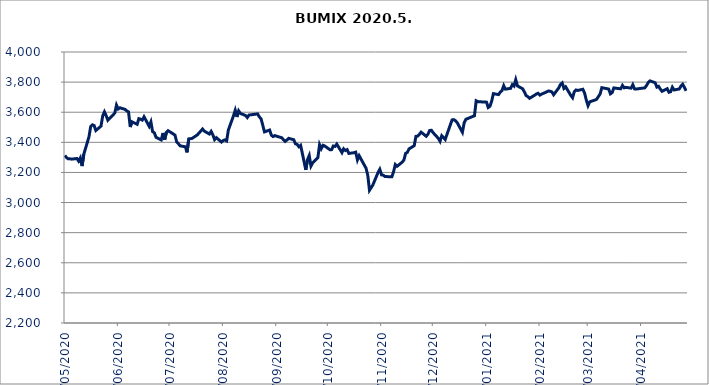
| Category | BUMIX |
|---|---|
| 04/05/2020 | 3312.857 |
| 05/05/2020 | 3298.356 |
| 06/05/2020 | 3290.116 |
| 07/05/2020 | 3290.63 |
| 08/05/2020 | 3288.226 |
| 11/05/2020 | 3292.683 |
| 12/05/2020 | 3275.228 |
| 13/05/2020 | 3296.53 |
| 14/05/2020 | 3242.319 |
| 15/05/2020 | 3320.851 |
| 18/05/2020 | 3436.227 |
| 19/05/2020 | 3504.886 |
| 20/05/2020 | 3516.58 |
| 21/05/2020 | 3511.622 |
| 22/05/2020 | 3478.592 |
| 25/05/2020 | 3507.883 |
| 26/05/2020 | 3576.134 |
| 27/05/2020 | 3602.548 |
| 28/05/2020 | 3576.97 |
| 29/05/2020 | 3546.922 |
| 02/06/2020 | 3594.239 |
| 03/06/2020 | 3647.393 |
| 04/06/2020 | 3621.769 |
| 05/06/2020 | 3629.497 |
| 08/06/2020 | 3618.717 |
| 09/06/2020 | 3608.736 |
| 10/06/2020 | 3601.796 |
| 11/06/2020 | 3501.797 |
| 12/06/2020 | 3536.763 |
| 15/06/2020 | 3519.634 |
| 16/06/2020 | 3557.404 |
| 17/06/2020 | 3553.83 |
| 18/06/2020 | 3547.652 |
| 19/06/2020 | 3569.854 |
| 22/06/2020 | 3506.192 |
| 23/06/2020 | 3535.486 |
| 24/06/2020 | 3470.553 |
| 25/06/2020 | 3463.496 |
| 26/06/2020 | 3432.731 |
| 29/06/2020 | 3416.07 |
| 30/06/2020 | 3461.98 |
| 01/07/2020 | 3416.81 |
| 02/07/2020 | 3466.2 |
| 03/07/2020 | 3477.25 |
| 06/07/2020 | 3455.57 |
| 07/07/2020 | 3447.7 |
| 08/07/2020 | 3402.34 |
| 09/07/2020 | 3390.36 |
| 10/07/2020 | 3376.63 |
| 13/07/2020 | 3370.43 |
| 14/07/2020 | 3333.48 |
| 15/07/2020 | 3423.08 |
| 16/07/2020 | 3424.08 |
| 17/07/2020 | 3426.43 |
| 20/07/2020 | 3449.86 |
| 21/07/2020 | 3462.4 |
| 22/07/2020 | 3475.18 |
| 23/07/2020 | 3488.48 |
| 24/07/2020 | 3474.49 |
| 27/07/2020 | 3455.12 |
| 28/07/2020 | 3472.66 |
| 29/07/2020 | 3449.53 |
| 30/07/2020 | 3418.31 |
| 31/07/2020 | 3431.21 |
| 03/08/2020 | 3401.97 |
| 04/08/2020 | 3411.95 |
| 05/08/2020 | 3416.29 |
| 06/08/2020 | 3409.59 |
| 07/08/2020 | 3481.72 |
| 10/08/2020 | 3576.54 |
| 11/08/2020 | 3613.16 |
| 12/08/2020 | 3568.41 |
| 13/08/2020 | 3609.29 |
| 14/08/2020 | 3592 |
| 17/08/2020 | 3578.22 |
| 18/08/2020 | 3564.56 |
| 19/08/2020 | 3581.3 |
| 24/08/2020 | 3588.71 |
| 25/08/2020 | 3568.88 |
| 26/08/2020 | 3556.56 |
| 27/08/2020 | 3513.57 |
| 28/08/2020 | 3469.22 |
| 31/08/2020 | 3481.8 |
| 01/09/2020 | 3447.2 |
| 02/09/2020 | 3438.46 |
| 03/09/2020 | 3445.17 |
| 04/09/2020 | 3440.86 |
| 07/09/2020 | 3430.65 |
| 08/09/2020 | 3417.52 |
| 09/09/2020 | 3406.05 |
| 10/09/2020 | 3415.25 |
| 11/09/2020 | 3426.71 |
| 14/09/2020 | 3417.2 |
| 15/09/2020 | 3390.17 |
| 16/09/2020 | 3386.09 |
| 17/09/2020 | 3370.49 |
| 18/09/2020 | 3380.1 |
| 21/09/2020 | 3217.33 |
| 22/09/2020 | 3285.6 |
| 23/09/2020 | 3312.51 |
| 24/09/2020 | 3242.4 |
| 25/09/2020 | 3263.45 |
| 28/09/2020 | 3297.41 |
| 29/09/2020 | 3384.4 |
| 30/09/2020 | 3357.82 |
| 01/10/2020 | 3380.37 |
| 02/10/2020 | 3375.87 |
| 05/10/2020 | 3350.89 |
| 06/10/2020 | 3351.47 |
| 07/10/2020 | 3375.67 |
| 08/10/2020 | 3372.9 |
| 09/10/2020 | 3388.36 |
| 12/10/2020 | 3331.7 |
| 13/10/2020 | 3357.1 |
| 14/10/2020 | 3345.75 |
| 15/10/2020 | 3351.72 |
| 16/10/2020 | 3326.29 |
| 19/10/2020 | 3331.12 |
| 20/10/2020 | 3334.91 |
| 21/10/2020 | 3283.17 |
| 22/10/2020 | 3311.3 |
| 26/10/2020 | 3228.15 |
| 27/10/2020 | 3182.22 |
| 28/10/2020 | 3081.52 |
| 29/10/2020 | 3098.86 |
| 30/10/2020 | 3117.81 |
| 02/11/2020 | 3200.25 |
| 03/11/2020 | 3220.92 |
| 04/11/2020 | 3183.95 |
| 05/11/2020 | 3181.86 |
| 06/11/2020 | 3172.91 |
| 09/11/2020 | 3171.47 |
| 10/11/2020 | 3171.23 |
| 11/11/2020 | 3204.99 |
| 12/11/2020 | 3252 |
| 13/11/2020 | 3240.74 |
| 16/11/2020 | 3268.32 |
| 17/11/2020 | 3282.14 |
| 18/11/2020 | 3326.62 |
| 19/11/2020 | 3333.37 |
| 20/11/2020 | 3356.65 |
| 23/11/2020 | 3377.82 |
| 24/11/2020 | 3439.84 |
| 25/11/2020 | 3441.29 |
| 26/11/2020 | 3453.36 |
| 27/11/2020 | 3467.59 |
| 30/11/2020 | 3440.21 |
| 01/12/2020 | 3454.61 |
| 02/12/2020 | 3479.14 |
| 03/12/2020 | 3479.7 |
| 04/12/2020 | 3463.96 |
| 07/12/2020 | 3426.71 |
| 08/12/2020 | 3406.79 |
| 09/12/2020 | 3444.12 |
| 10/12/2020 | 3431.99 |
| 11/12/2020 | 3418.86 |
| 14/12/2020 | 3517.03 |
| 15/12/2020 | 3549.02 |
| 16/12/2020 | 3550.69 |
| 17/12/2020 | 3543.31 |
| 18/12/2020 | 3530.03 |
| 21/12/2020 | 3466.56 |
| 22/12/2020 | 3528.93 |
| 23/12/2020 | 3553 |
| 28/12/2020 | 3576.63 |
| 29/12/2020 | 3676.15 |
| 30/12/2020 | 3670.042 |
| 04/01/2021 | 3666.94 |
| 05/01/2021 | 3631.47 |
| 06/01/2021 | 3639.83 |
| 07/01/2021 | 3673.66 |
| 08/01/2021 | 3723.52 |
| 11/01/2021 | 3717.11 |
| 12/01/2021 | 3733.93 |
| 13/01/2021 | 3743.66 |
| 14/01/2021 | 3776.42 |
| 15/01/2021 | 3753.13 |
| 18/01/2021 | 3758.69 |
| 19/01/2021 | 3783.21 |
| 20/01/2021 | 3774.08 |
| 21/01/2021 | 3816.27 |
| 22/01/2021 | 3774.64 |
| 25/01/2021 | 3755.75 |
| 26/01/2021 | 3735.14 |
| 27/01/2021 | 3711.23 |
| 28/01/2021 | 3703.47 |
| 29/01/2021 | 3692.35 |
| 01/02/2021 | 3713.3 |
| 02/02/2021 | 3721.16 |
| 03/02/2021 | 3725.78 |
| 04/02/2021 | 3713.5 |
| 05/02/2021 | 3720.14 |
| 08/02/2021 | 3735.17 |
| 09/02/2021 | 3741.05 |
| 10/02/2021 | 3739.45 |
| 11/02/2021 | 3735 |
| 12/02/2021 | 3716.17 |
| 15/02/2021 | 3761.64 |
| 16/02/2021 | 3784.64 |
| 17/02/2021 | 3794.47 |
| 18/02/2021 | 3757.86 |
| 19/02/2021 | 3768.62 |
| 22/02/2021 | 3711.29 |
| 23/02/2021 | 3696.27 |
| 24/02/2021 | 3736.18 |
| 25/02/2021 | 3747.99 |
| 26/02/2021 | 3744.67 |
| 01/03/2021 | 3752.44 |
| 02/03/2021 | 3726.66 |
| 03/03/2021 | 3680.33 |
| 04/03/2021 | 3643.62 |
| 05/03/2021 | 3669.15 |
| 08/03/2021 | 3680.69 |
| 09/03/2021 | 3686.14 |
| 10/03/2021 | 3703.66 |
| 11/03/2021 | 3720.43 |
| 12/03/2021 | 3762.99 |
| 16/03/2021 | 3753.85 |
| 17/03/2021 | 3722.11 |
| 18/03/2021 | 3730.13 |
| 19/03/2021 | 3761.3 |
| 22/03/2021 | 3756.8 |
| 23/03/2021 | 3756.18 |
| 24/03/2021 | 3778.02 |
| 25/03/2021 | 3762.1 |
| 26/03/2021 | 3765.17 |
| 29/03/2021 | 3760.12 |
| 30/03/2021 | 3782.9 |
| 31/03/2021 | 3754.86 |
| 01/04/2021 | 3754.04 |
| 06/04/2021 | 3761.95 |
| 07/04/2021 | 3777.27 |
| 08/04/2021 | 3798.2 |
| 09/04/2021 | 3808.26 |
| 12/04/2021 | 3795.78 |
| 13/04/2021 | 3766.75 |
| 14/04/2021 | 3771.86 |
| 15/04/2021 | 3753.41 |
| 16/04/2021 | 3738.77 |
| 19/04/2021 | 3756.43 |
| 20/04/2021 | 3732.67 |
| 21/04/2021 | 3736.16 |
| 22/04/2021 | 3766.06 |
| 23/04/2021 | 3747.88 |
| 26/04/2021 | 3754.41 |
| 27/04/2021 | 3774.04 |
| 28/04/2021 | 3785.46 |
| 29/04/2021 | 3764.89 |
| 30/04/2021 | 3742.28 |